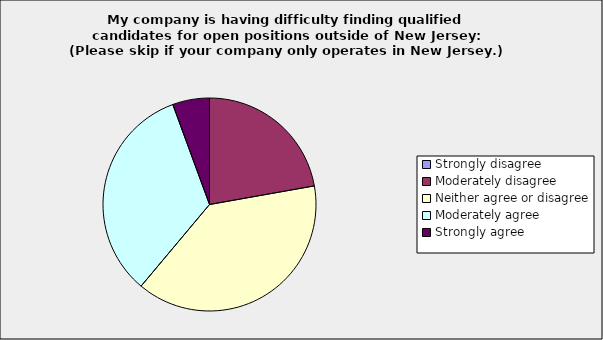
| Category | Series 0 |
|---|---|
| Strongly disagree | 0 |
| Moderately disagree | 0.222 |
| Neither agree or disagree | 0.389 |
| Moderately agree | 0.333 |
| Strongly agree | 0.056 |